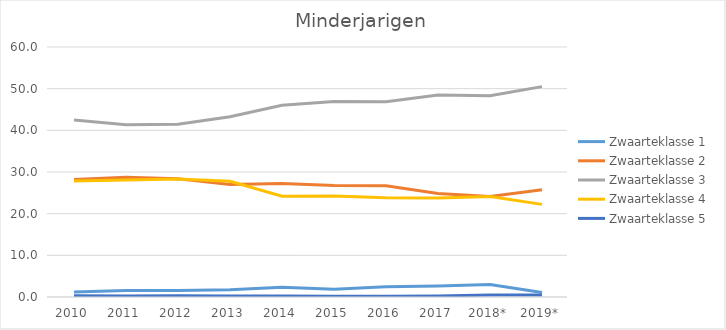
| Category | Zwaarteklasse 1 | Zwaarteklasse 2 | Zwaarteklasse 3 | Zwaarteklasse 4 | Zwaarteklasse 5 |
|---|---|---|---|---|---|
| 2010 | 1.216 | 28.21 | 42.462 | 27.839 | 0.272 |
| 2011 | 1.551 | 28.747 | 41.365 | 28.086 | 0.251 |
| 2012 | 1.533 | 28.382 | 41.48 | 28.329 | 0.276 |
| 2013 | 1.741 | 26.995 | 43.26 | 27.794 | 0.211 |
| 2014 | 2.333 | 27.211 | 46.001 | 24.21 | 0.246 |
| 2015 | 1.885 | 26.775 | 46.938 | 24.245 | 0.157 |
| 2016 | 2.451 | 26.675 | 46.848 | 23.837 | 0.19 |
| 2017 | 2.641 | 24.839 | 48.499 | 23.752 | 0.268 |
| 2018* | 3.018 | 24.135 | 48.285 | 24.094 | 0.468 |
| 2019* | 1.091 | 25.733 | 50.489 | 22.231 | 0.455 |